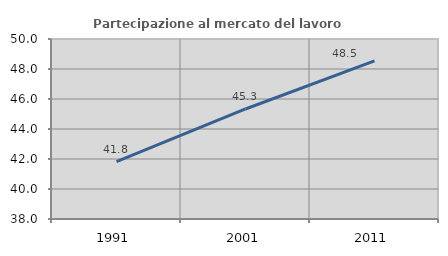
| Category | Partecipazione al mercato del lavoro  femminile |
|---|---|
| 1991.0 | 41.823 |
| 2001.0 | 45.335 |
| 2011.0 | 48.536 |